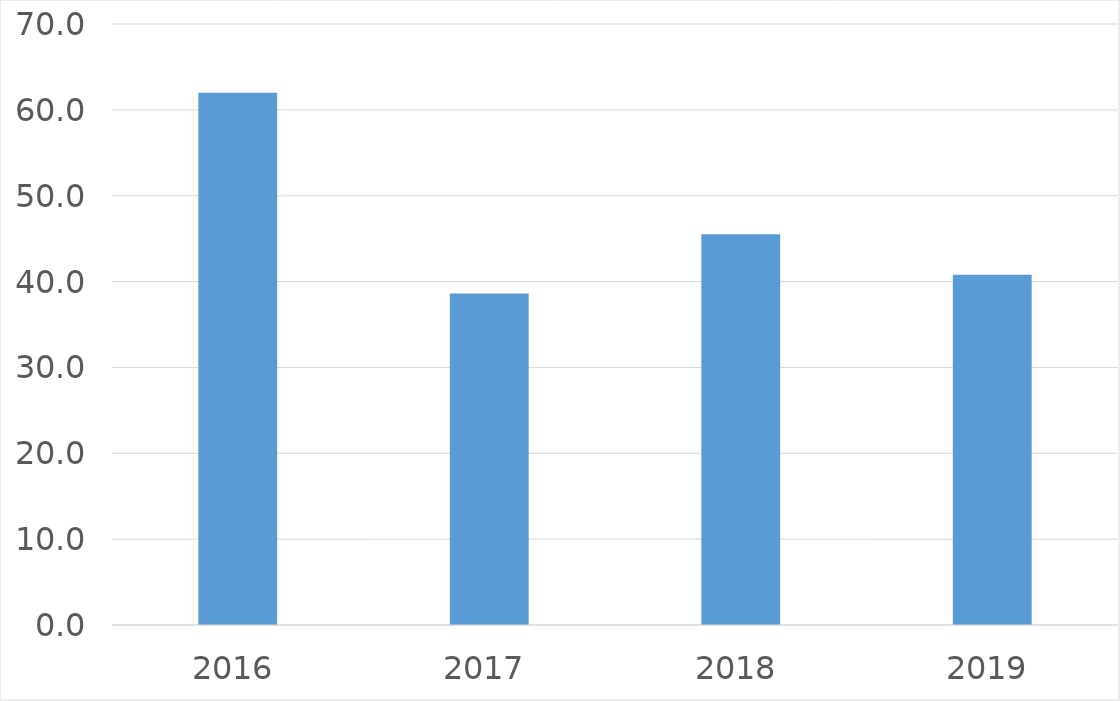
| Category | Series 0 |
|---|---|
| 2016 | 62 |
| 2017 | 38.6 |
| 2018 | 45.5 |
| 2019 | 40.8 |